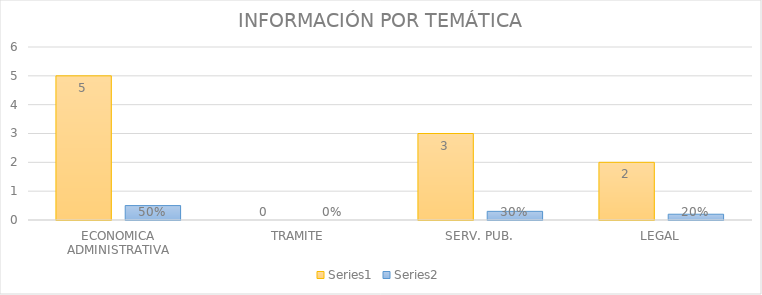
| Category | Series 3 | Series 4 |
|---|---|---|
| ECONOMICA ADMINISTRATIVA | 5 | 0.5 |
| TRAMITE | 0 | 0 |
| SERV. PUB. | 3 | 0.3 |
| LEGAL | 2 | 0.2 |